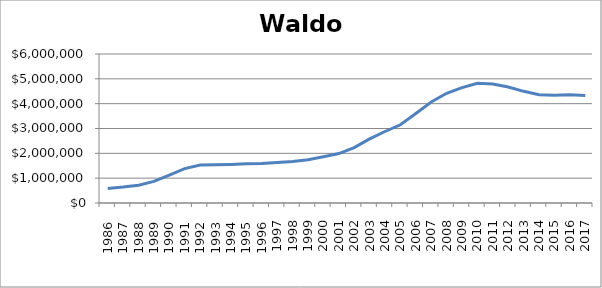
| Category | Waldo (000s) |
|---|---|
|       1986 | 584850 |
|       1987 | 644000 |
|       1988 | 718900 |
|       1989 | 872200 |
|       1990 | 1126050 |
|       1991 | 1382950 |
|       1992 | 1529150 |
|       1993 | 1539750 |
|       1994 | 1555100 |
|       1995 | 1578100 |
|       1996 | 1589700 |
| 1997 | 1635050 |
| 1998 | 1675100 |
| 1999 | 1743100 |
| 2000 | 1864750 |
| 2001 | 1991600 |
| 2002 | 2229000 |
| 2003 | 2580000 |
| 2004 | 2879500 |
| 2005 | 3148400 |
| 2006 | 3603700 |
| 2007 | 4067050 |
| 2008 | 4419300 |
| 2009 | 4645350 |
| 2010 | 4822250 |
| 2011 | 4792900 |
| 2012 | 4672950 |
| 2013 | 4496600 |
| 2014 | 4356700 |
| 2015 | 4340100 |
| 2016 | 4360250 |
| 2017 | 4326850 |